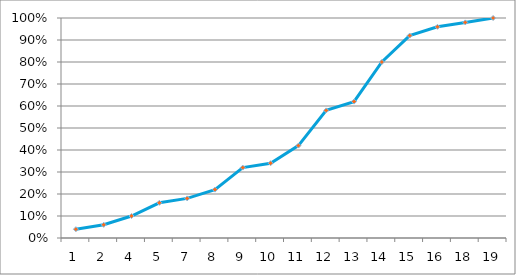
| Category | Fréquence cumulée |
|---|---|
| 1.0 | 0.04 |
| 2.0 | 0.06 |
| 4.0 | 0.1 |
| 5.0 | 0.16 |
| 7.0 | 0.18 |
| 8.0 | 0.22 |
| 9.0 | 0.32 |
| 10.0 | 0.34 |
| 11.0 | 0.42 |
| 12.0 | 0.58 |
| 13.0 | 0.62 |
| 14.0 | 0.8 |
| 15.0 | 0.92 |
| 16.0 | 0.96 |
| 18.0 | 0.98 |
| 19.0 | 1 |